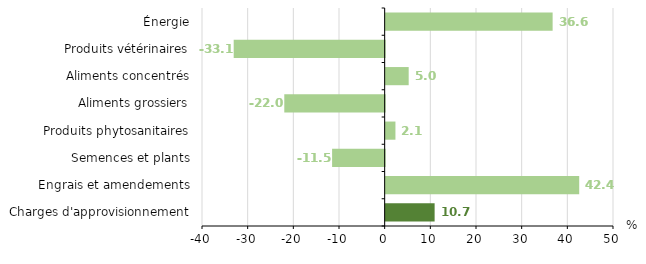
| Category | Series 0 |
|---|---|
| Charges d'approvisionnement | 10.72 |
| Engrais et amendements | 42.38 |
| Semences et plants | -11.51 |
| Produits phytosanitaires | 2.14 |
| Aliments grossiers | -21.98 |
| Aliments concentrés | 5.04 |
| Produits vétérinaires | -33.06 |
| Énergie | 36.56 |